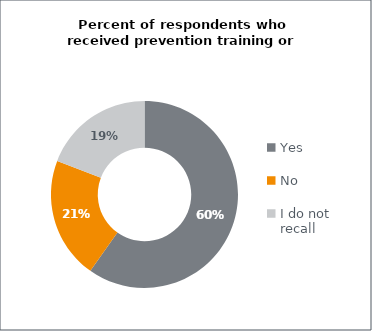
| Category | Series 0 |
|---|---|
| Yes | 0.598 |
| No | 0.21 |
| I do not recall | 0.192 |